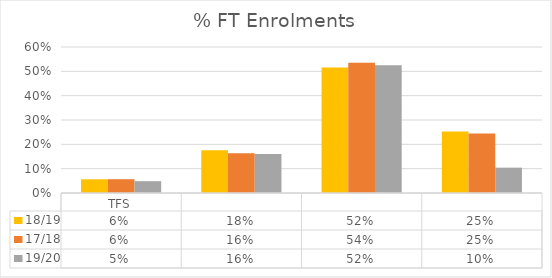
| Category | 18/19 | 17/18 | 19/20 |
|---|---|---|---|
| TFS | 0.056 | 0.057 | 0.049 |